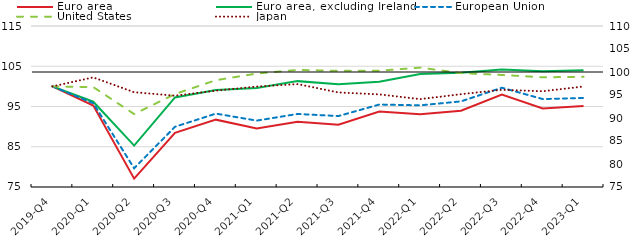
| Category | Euro area | Euro area, excluding Ireland | European Union | United States | Japan |
|---|---|---|---|---|---|
| 2019-Q4 | 100 | 100 | 100 | 100 | 100 |
| 2020-Q1 | 95.235 | 96.188 | 95.808 | 99.815 | 102.232 |
| 2020-Q2 | 77.08 | 85.283 | 79.653 | 93.121 | 98.544 |
| 2020-Q3 | 88.449 | 97.262 | 89.961 | 98.103 | 97.684 |
| 2020-Q4 | 91.732 | 99.122 | 93.23 | 101.534 | 98.929 |
| 2021-Q1 | 89.562 | 99.578 | 91.497 | 103.183 | 99.954 |
| 2021-Q2 | 91.191 | 101.303 | 93.143 | 104.087 | 100.564 |
| 2021-Q3 | 90.476 | 100.5 | 92.627 | 103.863 | 98.487 |
| 2021-Q4 | 93.764 | 101.144 | 95.485 | 103.891 | 98.009 |
| 2022-Q1 | 93.101 | 103.089 | 95.294 | 104.66 | 96.829 |
| 2022-Q2 | 93.963 | 103.385 | 96.272 | 103.295 | 98.061 |
| 2022-Q3 | 97.982 | 104.17 | 99.663 | 102.84 | 99.144 |
| 2022-Q4 | 94.534 | 103.731 | 96.847 | 102.258 | 98.787 |
| 2023-Q1 | 95.137 | 104.03 | 97.121 | 102.376 | 99.974 |